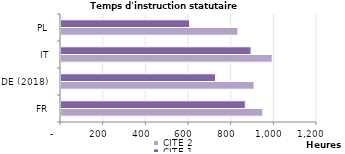
| Category | CITE 2 | CITE 1 |
|---|---|---|
| FR | 946 | 864 |
| DE (2018) | 905.245 | 724.1 |
| IT | 990 | 891 |
| PL | 829.4 | 603.1 |